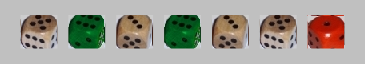
| Category | 1 | 2 | 3 | 4 | 5 | 6 |
|---|---|---|---|---|---|---|
| 5.0 | -1 | 0 | 0 | 0 | 1 | 0 |
| 6.0 | -1 | 0 | 0 | 0 | 0 | 1 |
| 3.0 | -1 | 0 | 1 | 0 | 0 | 0 |
| 6.0 | -1 | 0 | 0 | 0 | 0 | 1 |
| 3.0 | -1 | 0 | 1 | 0 | 0 | 0 |
| 5.0 | -1 | 0 | 0 | 0 | 1 | 0 |
| 1.0 | 1 | 0 | 0 | 0 | 0 | 0 |